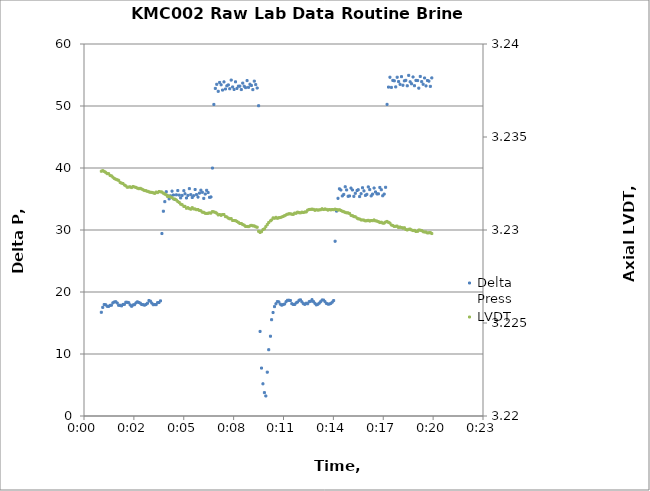
| Category | Delta Press |
|---|---|
| 0.0006944444444444445 | 16.73 |
| 0.0007523148137907912 | 17.52 |
| 0.0008101851831371379 | 17.98 |
| 0.0008680555524834846 | 17.94 |
| 0.0009259259218298313 | 17.71 |
| 0.0009837962984521357 | 17.67 |
| 0.0010416666677984824 | 17.84 |
| 0.0010995370371448291 | 17.87 |
| 0.0011574074064911758 | 18.25 |
| 0.0012152777758375225 | 18.39 |
| 0.0012731481451838693 | 18.43 |
| 0.001331018514530216 | 18.23 |
| 0.0013888888911525203 | 17.86 |
| 0.001446759260498867 | 17.86 |
| 0.0015046296298452137 | 17.76 |
| 0.0015624999991915604 | 17.99 |
| 0.001620370368537907 | 18.01 |
| 0.0016782407378842538 | 18.35 |
| 0.0017361111072306005 | 18.34 |
| 0.0017939814838529048 | 18.27 |
| 0.0018518518531992515 | 17.92 |
| 0.0019097222225455983 | 17.7 |
| 0.001967592591891945 | 17.91 |
| 0.0020254629612382917 | 17.96 |
| 0.0020833333305846384 | 18.24 |
| 0.002141203699930985 | 18.41 |
| 0.0021990740765532894 | 18.31 |
| 0.002256944445899636 | 18.2 |
| 0.002314814815245983 | 17.98 |
| 0.0023726851845923295 | 17.95 |
| 0.0024305555539386762 | 17.88 |
| 0.002488425923285023 | 18 |
| 0.0025462962926313696 | 18.19 |
| 0.0026041666619777163 | 18.63 |
| 0.0026620370386000207 | 18.52 |
| 0.0027199074079463674 | 18.21 |
| 0.002777777777292714 | 17.95 |
| 0.0028356481466390608 | 17.97 |
| 0.0028935185159854075 | 17.96 |
| 0.002951388885331754 | 18.28 |
| 0.003009259254678101 | 18.31 |
| 0.003067129631300405 | 18.57 |
| 0.003125000000646752 | 29.43 |
| 0.0031828703699930986 | 33.03 |
| 0.0032407407393394453 | 34.57 |
| 0.003298611108685792 | 36.17 |
| 0.0033564814780321387 | 35.51 |
| 0.0034143518473784855 | 35.02 |
| 0.0034722222240007898 | 35.51 |
| 0.0035300925933471365 | 36.27 |
| 0.003587962962693483 | 35.65 |
| 0.00364583333203983 | 34.92 |
| 0.0037037037013861766 | 35.67 |
| 0.0037615740707325233 | 36.36 |
| 0.00381944444007887 | 35.63 |
| 0.0038773148167011743 | 35.18 |
| 0.003935185186047521 | 35.58 |
| 0.0040046296248975625 | 36.34 |
| 0.0040509259247402144 | 35.84 |
| 0.004108796294086561 | 35.16 |
| 0.004166666663432908 | 35.58 |
| 0.004224537032779255 | 36.67 |
| 0.004282407409401559 | 35.7 |
| 0.004340277778747906 | 35.24 |
| 0.004398148148094252 | 35.53 |
| 0.004456018517440599 | 36.53 |
| 0.004513888886786946 | 35.71 |
| 0.004571759256133292 | 35.31 |
| 0.004629629625479639 | 35.95 |
| 0.0046875000021019434 | 36.42 |
| 0.00474537037144829 | 36.08 |
| 0.004803240740794637 | 35.1 |
| 0.0048611111101409836 | 35.8 |
| 0.00491898147948733 | 36.4 |
| 0.004976851848833677 | 36.04 |
| 0.005034722218180024 | 35.27 |
| 0.005092592594802328 | 35.33 |
| 0.005150462964148675 | 39.99 |
| 0.005208333333495021 | 50.25 |
| 0.005266203702841368 | 52.84 |
| 0.005324074072187715 | 53.5 |
| 0.0053819444415340615 | 52.37 |
| 0.005439814810880408 | 53.8 |
| 0.0054976851875027126 | 53.42 |
| 0.005555555556849059 | 52.57 |
| 0.005613425926195406 | 53.89 |
| 0.005671296295541753 | 52.74 |
| 0.005729166664888099 | 53.25 |
| 0.005787037034234446 | 53.4 |
| 0.005844907403580793 | 52.78 |
| 0.005902777780203097 | 54.18 |
| 0.005960648149549444 | 53.07 |
| 0.0060185185188957905 | 52.67 |
| 0.006076388888242137 | 53.9 |
| 0.006134259257588484 | 52.84 |
| 0.006192129626934831 | 53.2 |
| 0.006249999996281177 | 53.2 |
| 0.006307870365627524 | 52.65 |
| 0.006365740742249828 | 53.69 |
| 0.006423611111596175 | 53.19 |
| 0.006481481480942522 | 52.96 |
| 0.0065393518502888685 | 54.1 |
| 0.006597222219635215 | 53.01 |
| 0.006655092588981562 | 53.51 |
| 0.006712962958327909 | 53.31 |
| 0.006770833334950213 | 52.64 |
| 0.00682870370429656 | 54.01 |
| 0.006886574073642906 | 53.45 |
| 0.006944444442989253 | 52.9 |
| 0.0070023148123356 | 50.04 |
| 0.0070601851816819465 | 13.64 |
| 0.007118055551028293 | 7.73 |
| 0.0071759259276505975 | 5.19 |
| 0.007233796296996944 | 3.77 |
| 0.007291666666343291 | 3.23 |
| 0.007349537035689638 | 7.07 |
| 0.007407407405035984 | 10.69 |
| 0.007476851851161983 | 12.87 |
| 0.007523148143728678 | 15.53 |
| 0.007581018520350982 | 16.69 |
| 0.007638888889697329 | 17.64 |
| 0.0076967592590436755 | 18.1 |
| 0.007754629628390022 | 18.45 |
| 0.007812499997736369 | 18.4 |
| 0.007870370367082716 | 18.04 |
| 0.007928240736429063 | 17.88 |
| 0.007986111113051367 | 17.97 |
| 0.008043981482397714 | 18.06 |
| 0.008101851851744061 | 18.43 |
| 0.008159722221090408 | 18.66 |
| 0.008217592590436754 | 18.67 |
| 0.008275462959783101 | 18.63 |
| 0.008333333329129448 | 18.12 |
| 0.008391203705751752 | 17.99 |
| 0.008449074075098099 | 17.99 |
| 0.008506944444444445 | 18.24 |
| 0.008564814813790792 | 18.38 |
| 0.008622685183137139 | 18.66 |
| 0.008680555552483486 | 18.73 |
| 0.008738425921829832 | 18.41 |
| 0.008796296298452137 | 18.12 |
| 0.008854166667798483 | 18.01 |
| 0.00891203703714483 | 18.19 |
| 0.008969907406491177 | 18.1 |
| 0.009027777775837523 | 18.43 |
| 0.00908564814518387 | 18.5 |
| 0.009143518514530217 | 18.76 |
| 0.009201388891152521 | 18.45 |
| 0.009259259260498868 | 18.18 |
| 0.009317129629845215 | 17.92 |
| 0.009374999999191561 | 18.02 |
| 0.009432870368537908 | 18.2 |
| 0.009490740737884255 | 18.44 |
| 0.009548611107230601 | 18.71 |
| 0.009606481483852906 | 18.7 |
| 0.009664351853199252 | 18.44 |
| 0.009722222222545599 | 18.16 |
| 0.009780092591891946 | 18.05 |
| 0.009837962961238293 | 18.05 |
| 0.00989583333058464 | 18.16 |
| 0.009953703699930986 | 18.36 |
| 0.01001157407655329 | 18.62 |
| 0.010069444445899637 | 28.19 |
| 0.010127314815245984 | 33.049 |
| 0.01018518518459233 | 35.11 |
| 0.010243055553938677 | 36.64 |
| 0.010300925923285024 | 36.45 |
| 0.01035879629263137 | 35.49 |
| 0.010416666661977717 | 35.74 |
| 0.010474537038600022 | 36.97 |
| 0.010532407407946368 | 36.46 |
| 0.010590277777292715 | 35.44 |
| 0.010648148146639062 | 35.49 |
| 0.010706018515985408 | 36.76 |
| 0.010763888885331755 | 36.45 |
| 0.010821759254678102 | 35.43 |
| 0.010879629631300406 | 35.92 |
| 0.010949074070150448 | 36.37 |
| 0.0109953703699931 | 36.49 |
| 0.011053240739339446 | 35.39 |
| 0.011111111108685793 | 35.85 |
| 0.01116898147803214 | 36.81 |
| 0.011226851847378486 | 36.31 |
| 0.01128472222400079 | 35.58 |
| 0.011342592593347137 | 35.75 |
| 0.011400462962693484 | 36.95 |
| 0.01145833333203983 | 36.51 |
| 0.011516203701386177 | 35.5 |
| 0.011574074070732524 | 35.79 |
| 0.011631944440078871 | 36.77 |
| 0.011689814816701175 | 36.14 |
| 0.011747685186047522 | 35.82 |
| 0.011805555555393869 | 35.83 |
| 0.011863425924740215 | 36.86 |
| 0.011921296294086562 | 36.49 |
| 0.011979166663432909 | 35.52 |
| 0.012037037032779255 | 35.79 |
| 0.01209490740940156 | 36.89 |
| 0.012152777778747906 | 50.26 |
| 0.012210648148094253 | 53.05 |
| 0.0122685185174406 | 54.64 |
| 0.012326388886786947 | 53 |
| 0.012384259256133293 | 54.13 |
| 0.01244212962547964 | 54.06 |
| 0.012500000002101944 | 53.08 |
| 0.012557870371448291 | 54.64 |
| 0.012615740740794638 | 53.94 |
| 0.012673611110140984 | 53.5 |
| 0.012731481479487331 | 54.73 |
| 0.012789351848833678 | 53.35 |
| 0.012847222218180025 | 54.05 |
| 0.012905092594802329 | 54.14 |
| 0.012962962964148676 | 53.26 |
| 0.013020833333495022 | 54.94 |
| 0.013078703702841369 | 53.9 |
| 0.013136574072187716 | 53.58 |
| 0.013194444441534062 | 54.68 |
| 0.013252314810880409 | 53.27 |
| 0.013310185187502713 | 54.13 |
| 0.013379629626352755 | 54.1 |
| 0.013425925926195407 | 52.88 |
| 0.013483796295541754 | 54.77 |
| 0.0135416666648881 | 53.93 |
| 0.013599537034234447 | 53.51 |
| 0.013657407403580794 | 54.52 |
| 0.013715277780203098 | 53.24 |
| 0.013773148149549445 | 54.11 |
| 0.013831018518895791 | 54.01 |
| 0.013888888888242138 | 53.17 |
| 0.013946759257588485 | 54.53 |